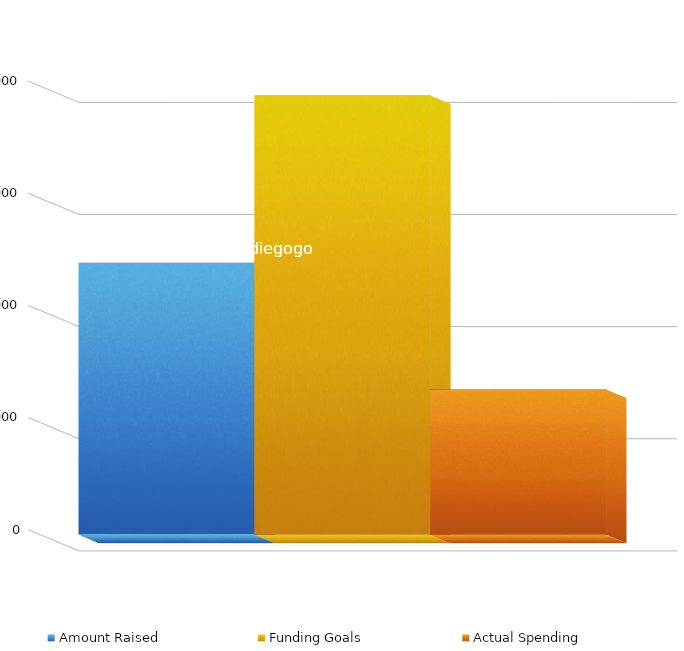
| Category | Amount Raised | Series 1 | Funding Goals | Actual Spending |
|---|---|---|---|---|
| Indiegogo | 1212905 |  | 1958471 | 647575 |